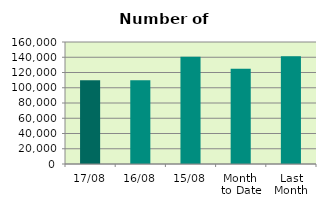
| Category | Series 0 |
|---|---|
| 17/08 | 109880 |
| 16/08 | 109974 |
| 15/08 | 140608 |
| Month 
to Date | 124954.308 |
| Last
Month | 141432.273 |